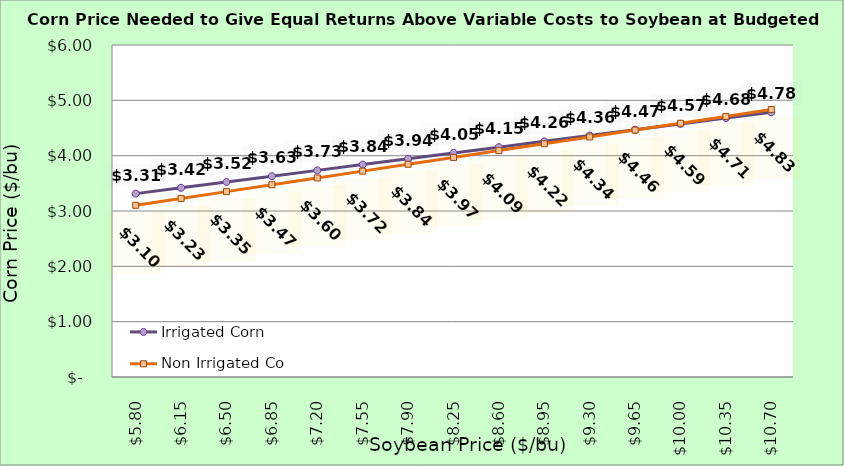
| Category | Irrigated Corn | Non Irrigated Corn |
|---|---|---|
| 5.8000000000000025 | 3.314 | 3.103 |
| 6.150000000000002 | 3.419 | 3.227 |
| 6.500000000000002 | 3.524 | 3.35 |
| 6.850000000000001 | 3.629 | 3.474 |
| 7.200000000000001 | 3.734 | 3.597 |
| 7.550000000000001 | 3.839 | 3.721 |
| 7.9 | 3.944 | 3.844 |
| 8.25 | 4.049 | 3.968 |
| 8.6 | 4.154 | 4.091 |
| 8.95 | 4.259 | 4.215 |
| 9.299999999999999 | 4.364 | 4.339 |
| 9.649999999999999 | 4.469 | 4.462 |
| 9.999999999999998 | 4.574 | 4.586 |
| 10.349999999999998 | 4.679 | 4.709 |
| 10.699999999999998 | 4.784 | 4.833 |